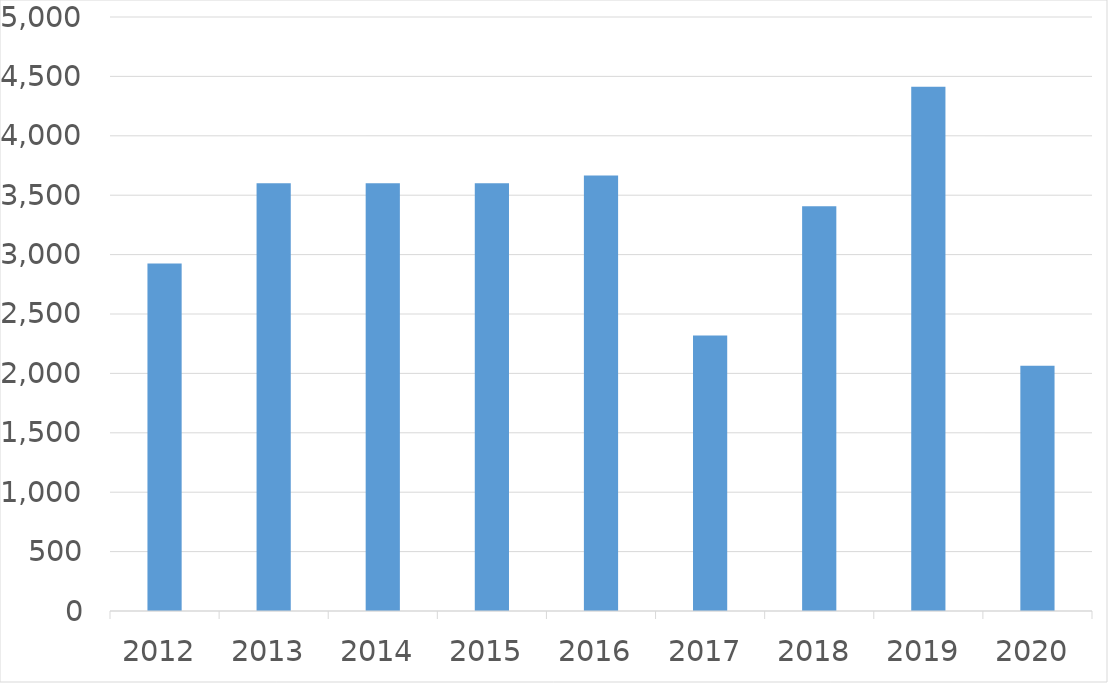
| Category | Series 0 |
|---|---|
| 2012 | 2925 |
| 2013 | 3600 |
| 2014 | 3600 |
| 2015 | 3600 |
| 2016 | 3666 |
| 2017 | 2320 |
| 2018 | 3406 |
| 2019 | 4413 |
| 2020 | 2065 |